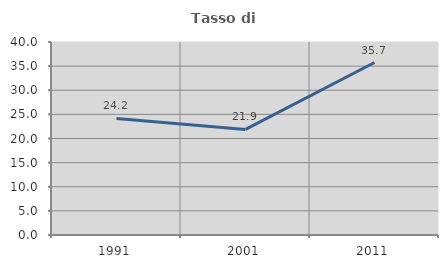
| Category | Tasso di occupazione   |
|---|---|
| 1991.0 | 24.155 |
| 2001.0 | 21.875 |
| 2011.0 | 35.749 |